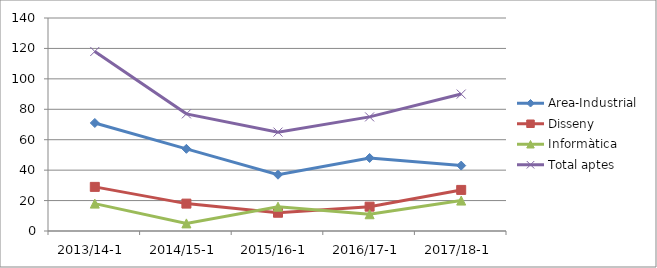
| Category | Area-Industrial | Disseny | Informàtica | Total aptes |
|---|---|---|---|---|
| 2013/14-1 | 71 | 29 | 18 | 118 |
| 2014/15-1 | 54 | 18 | 5 | 77 |
| 2015/16-1 | 37 | 12 | 16 | 65 |
| 2016/17-1 | 48 | 16 | 11 | 75 |
| 2017/18-1 | 43 | 27 | 20 | 90 |